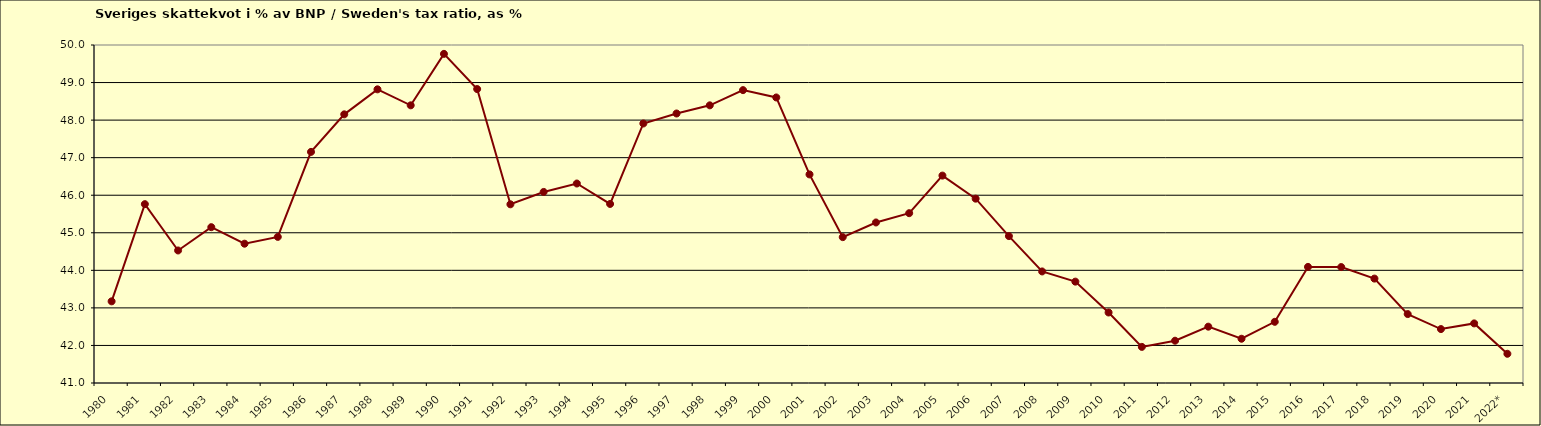
| Category | Series 0 |
|---|---|
| 1980 | 43.175 |
| 1981 | 45.762 |
| 1982 | 44.529 |
| 1983 | 45.149 |
| 1984 | 44.709 |
| 1985 | 44.891 |
| 1986 | 47.154 |
| 1987 | 48.154 |
| 1988 | 48.82 |
| 1989 | 48.394 |
| 1990 | 49.764 |
| 1991 | 48.827 |
| 1992 | 45.758 |
| 1993 | 46.087 |
| 1994 | 46.312 |
| 1995 | 45.767 |
| 1996 | 47.91 |
| 1997 | 48.176 |
| 1998 | 48.393 |
| 1999 | 48.798 |
| 2000 | 48.603 |
| 2001 | 46.554 |
| 2002 | 44.884 |
| 2003 | 45.274 |
| 2004 | 45.522 |
| 2005 | 46.522 |
| 2006 | 45.908 |
| 2007 | 44.912 |
| 2008 | 43.97 |
| 2009 | 43.699 |
| 2010 | 42.877 |
| 2011 | 41.962 |
| 2012 | 42.126 |
| 2013 | 42.5 |
| 2014 | 42.178 |
| 2015 | 42.629 |
| 2016 | 44.092 |
| 2017 | 44.087 |
| 2018 | 43.78 |
| 2019 | 42.836 |
| 2020 | 42.436 |
| 2021 | 42.587 |
| 2022* | 41.778 |